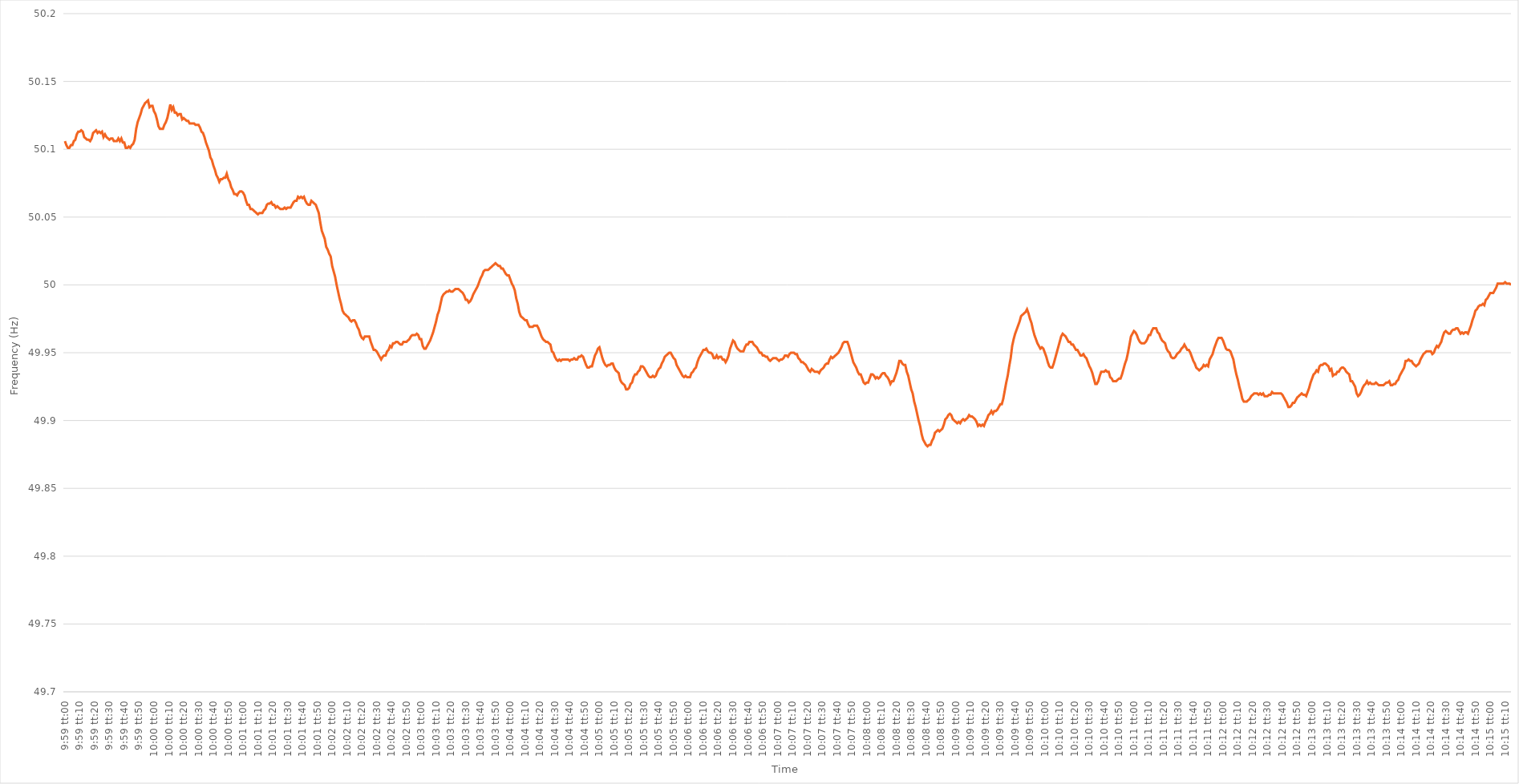
| Category | Series 0 |
|---|---|
| 0.4159722222222222 | 50.106 |
| 0.4159837962962963 | 50.103 |
| 0.4159953703703703 | 50.101 |
| 0.41600694444444447 | 50.101 |
| 0.4160185185185185 | 50.103 |
| 0.4160300925925926 | 50.103 |
| 0.41604166666666664 | 50.106 |
| 0.41605324074074074 | 50.107 |
| 0.4160648148148148 | 50.111 |
| 0.4160763888888889 | 50.113 |
| 0.41608796296296297 | 50.113 |
| 0.41609953703703706 | 50.114 |
| 0.4161111111111111 | 50.113 |
| 0.4161226851851852 | 50.109 |
| 0.41613425925925923 | 50.108 |
| 0.4161458333333334 | 50.107 |
| 0.4161574074074074 | 50.107 |
| 0.4161689814814815 | 50.106 |
| 0.41618055555555555 | 50.108 |
| 0.41619212962962965 | 50.112 |
| 0.4162037037037037 | 50.113 |
| 0.4162152777777777 | 50.114 |
| 0.4162268518518519 | 50.112 |
| 0.4162384259259259 | 50.113 |
| 0.41625 | 50.112 |
| 0.41626157407407405 | 50.113 |
| 0.41627314814814814 | 50.109 |
| 0.4162847222222222 | 50.111 |
| 0.41629629629629633 | 50.109 |
| 0.41630787037037037 | 50.108 |
| 0.41631944444444446 | 50.107 |
| 0.4163310185185185 | 50.108 |
| 0.4163425925925926 | 50.108 |
| 0.41635416666666664 | 50.106 |
| 0.4163657407407408 | 50.106 |
| 0.4163773148148148 | 50.106 |
| 0.4163888888888889 | 50.108 |
| 0.41640046296296296 | 50.106 |
| 0.41641203703703705 | 50.108 |
| 0.4164236111111111 | 50.105 |
| 0.41643518518518513 | 50.105 |
| 0.4164467592592593 | 50.101 |
| 0.4164583333333333 | 50.101 |
| 0.4164699074074074 | 50.102 |
| 0.41648148148148145 | 50.101 |
| 0.41649305555555555 | 50.103 |
| 0.4165046296296296 | 50.104 |
| 0.41651620370370374 | 50.107 |
| 0.4165277777777778 | 50.115 |
| 0.41653935185185187 | 50.12 |
| 0.4165509259259259 | 50.123 |
| 0.4165625 | 50.126 |
| 0.41657407407407404 | 50.13 |
| 0.4165856481481482 | 50.132 |
| 0.41659722222222223 | 50.134 |
| 0.4166087962962963 | 50.135 |
| 0.41662037037037036 | 50.136 |
| 0.41663194444444446 | 50.131 |
| 0.4166435185185185 | 50.132 |
| 0.41665509259259265 | 50.132 |
| 0.4166666666666667 | 50.128 |
| 0.4166782407407407 | 50.126 |
| 0.4166898148148148 | 50.122 |
| 0.41670138888888886 | 50.117 |
| 0.41671296296296295 | 50.115 |
| 0.416724537037037 | 50.115 |
| 0.41673611111111114 | 50.115 |
| 0.4167476851851852 | 50.118 |
| 0.4167592592592593 | 50.12 |
| 0.4167708333333333 | 50.123 |
| 0.4167824074074074 | 50.128 |
| 0.41679398148148145 | 50.133 |
| 0.4168055555555556 | 50.129 |
| 0.41681712962962963 | 50.131 |
| 0.41682870370370373 | 50.127 |
| 0.41684027777777777 | 50.127 |
| 0.41685185185185186 | 50.125 |
| 0.4168634259259259 | 50.126 |
| 0.41687500000000005 | 50.126 |
| 0.4168865740740741 | 50.122 |
| 0.4168981481481482 | 50.123 |
| 0.4169097222222222 | 50.122 |
| 0.41692129629629626 | 50.121 |
| 0.41693287037037036 | 50.121 |
| 0.4169444444444444 | 50.119 |
| 0.41695601851851855 | 50.119 |
| 0.4169675925925926 | 50.119 |
| 0.4169791666666667 | 50.119 |
| 0.4169907407407407 | 50.118 |
| 0.4170023148148148 | 50.118 |
| 0.41701388888888885 | 50.118 |
| 0.417025462962963 | 50.116 |
| 0.41703703703703704 | 50.113 |
| 0.41704861111111113 | 50.112 |
| 0.4170601851851852 | 50.109 |
| 0.41707175925925927 | 50.105 |
| 0.4170833333333333 | 50.102 |
| 0.41709490740740746 | 50.099 |
| 0.4171064814814815 | 50.094 |
| 0.4171180555555556 | 50.092 |
| 0.41712962962962963 | 50.088 |
| 0.41714120370370367 | 50.085 |
| 0.41715277777777776 | 50.081 |
| 0.4171643518518518 | 50.079 |
| 0.41717592592592595 | 50.076 |
| 0.4171875 | 50.078 |
| 0.4171990740740741 | 50.078 |
| 0.4172106481481481 | 50.079 |
| 0.4172222222222222 | 50.079 |
| 0.41723379629629626 | 50.082 |
| 0.4172453703703704 | 50.078 |
| 0.41725694444444444 | 50.076 |
| 0.41726851851851854 | 50.072 |
| 0.4172800925925926 | 50.07 |
| 0.41729166666666667 | 50.067 |
| 0.4173032407407407 | 50.067 |
| 0.41731481481481486 | 50.066 |
| 0.4173263888888889 | 50.068 |
| 0.417337962962963 | 50.069 |
| 0.41734953703703703 | 50.069 |
| 0.4173611111111111 | 50.068 |
| 0.41737268518518517 | 50.066 |
| 0.4173842592592592 | 50.062 |
| 0.41739583333333335 | 50.059 |
| 0.4174074074074074 | 50.059 |
| 0.4174189814814815 | 50.056 |
| 0.4174305555555555 | 50.056 |
| 0.4174421296296296 | 50.055 |
| 0.41745370370370366 | 50.054 |
| 0.4174652777777778 | 50.053 |
| 0.41747685185185185 | 50.052 |
| 0.41748842592592594 | 50.053 |
| 0.4175 | 50.053 |
| 0.4175115740740741 | 50.053 |
| 0.4175231481481481 | 50.055 |
| 0.41753472222222227 | 50.056 |
| 0.4175462962962963 | 50.059 |
| 0.4175578703703704 | 50.06 |
| 0.41756944444444444 | 50.06 |
| 0.41758101851851853 | 50.061 |
| 0.41759259259259257 | 50.059 |
| 0.4176041666666667 | 50.059 |
| 0.41761574074074076 | 50.057 |
| 0.4176273148148148 | 50.058 |
| 0.4176388888888889 | 50.057 |
| 0.41765046296296293 | 50.056 |
| 0.417662037037037 | 50.056 |
| 0.41767361111111106 | 50.056 |
| 0.4176851851851852 | 50.057 |
| 0.41769675925925925 | 50.056 |
| 0.41770833333333335 | 50.057 |
| 0.4177199074074074 | 50.057 |
| 0.4177314814814815 | 50.057 |
| 0.4177430555555555 | 50.059 |
| 0.41775462962962967 | 50.061 |
| 0.4177662037037037 | 50.062 |
| 0.4177777777777778 | 50.062 |
| 0.41778935185185184 | 50.065 |
| 0.41780092592592594 | 50.064 |
| 0.4178125 | 50.065 |
| 0.4178240740740741 | 50.064 |
| 0.41783564814814816 | 50.065 |
| 0.41784722222222226 | 50.062 |
| 0.4178587962962963 | 50.06 |
| 0.41787037037037034 | 50.059 |
| 0.41788194444444443 | 50.059 |
| 0.41789351851851847 | 50.062 |
| 0.4179050925925926 | 50.061 |
| 0.41791666666666666 | 50.06 |
| 0.41792824074074075 | 50.059 |
| 0.4179398148148148 | 50.056 |
| 0.4179513888888889 | 50.053 |
| 0.4179629629629629 | 50.046 |
| 0.4179745370370371 | 50.04 |
| 0.4179861111111111 | 50.037 |
| 0.4179976851851852 | 50.034 |
| 0.41800925925925925 | 50.028 |
| 0.41802083333333334 | 50.026 |
| 0.4180324074074074 | 50.023 |
| 0.41804398148148153 | 50.021 |
| 0.41805555555555557 | 50.014 |
| 0.41806712962962966 | 50.01 |
| 0.4180787037037037 | 50.006 |
| 0.41809027777777774 | 50 |
| 0.41810185185185184 | 49.995 |
| 0.4181134259259259 | 49.99 |
| 0.418125 | 49.986 |
| 0.41813657407407406 | 49.981 |
| 0.41814814814814816 | 49.979 |
| 0.4181597222222222 | 49.978 |
| 0.4181712962962963 | 49.977 |
| 0.41818287037037033 | 49.976 |
| 0.4181944444444445 | 49.974 |
| 0.4182060185185185 | 49.973 |
| 0.4182175925925926 | 49.974 |
| 0.41822916666666665 | 49.974 |
| 0.41824074074074075 | 49.972 |
| 0.4182523148148148 | 49.969 |
| 0.41826388888888894 | 49.967 |
| 0.418275462962963 | 49.963 |
| 0.41828703703703707 | 49.961 |
| 0.4182986111111111 | 49.96 |
| 0.4183101851851852 | 49.962 |
| 0.41832175925925924 | 49.962 |
| 0.4183333333333333 | 49.962 |
| 0.41834490740740743 | 49.962 |
| 0.41835648148148147 | 49.958 |
| 0.41836805555555556 | 49.955 |
| 0.4183796296296296 | 49.952 |
| 0.4183912037037037 | 49.952 |
| 0.41840277777777773 | 49.951 |
| 0.4184143518518519 | 49.949 |
| 0.4184259259259259 | 49.947 |
| 0.4184375 | 49.945 |
| 0.41844907407407406 | 49.947 |
| 0.41846064814814815 | 49.948 |
| 0.4184722222222222 | 49.948 |
| 0.41848379629629634 | 49.951 |
| 0.4184953703703704 | 49.952 |
| 0.4185069444444445 | 49.955 |
| 0.4185185185185185 | 49.954 |
| 0.4185300925925926 | 49.957 |
| 0.41854166666666665 | 49.957 |
| 0.4185532407407408 | 49.958 |
| 0.41856481481481483 | 49.958 |
| 0.4185763888888889 | 49.957 |
| 0.41858796296296297 | 49.956 |
| 0.418599537037037 | 49.956 |
| 0.4186111111111111 | 49.958 |
| 0.41862268518518514 | 49.958 |
| 0.4186342592592593 | 49.958 |
| 0.41864583333333333 | 49.959 |
| 0.4186574074074074 | 49.96 |
| 0.41866898148148146 | 49.962 |
| 0.41868055555555556 | 49.963 |
| 0.4186921296296296 | 49.963 |
| 0.41870370370370374 | 49.963 |
| 0.4187152777777778 | 49.964 |
| 0.4187268518518519 | 49.963 |
| 0.4187384259259259 | 49.96 |
| 0.41875 | 49.96 |
| 0.41876157407407405 | 49.955 |
| 0.4187731481481482 | 49.953 |
| 0.41878472222222224 | 49.953 |
| 0.41879629629629633 | 49.955 |
| 0.41880787037037037 | 49.957 |
| 0.4188194444444444 | 49.959 |
| 0.4188310185185185 | 49.962 |
| 0.41884259259259254 | 49.965 |
| 0.4188541666666667 | 49.969 |
| 0.41886574074074073 | 49.973 |
| 0.4188773148148148 | 49.978 |
| 0.41888888888888887 | 49.981 |
| 0.41890046296296296 | 49.986 |
| 0.418912037037037 | 49.991 |
| 0.41892361111111115 | 49.993 |
| 0.4189351851851852 | 49.994 |
| 0.4189467592592593 | 49.995 |
| 0.4189583333333333 | 49.995 |
| 0.4189699074074074 | 49.996 |
| 0.41898148148148145 | 49.995 |
| 0.4189930555555556 | 49.995 |
| 0.41900462962962964 | 49.996 |
| 0.41901620370370374 | 49.997 |
| 0.4190277777777778 | 49.997 |
| 0.4190393518518518 | 49.997 |
| 0.4190509259259259 | 49.996 |
| 0.41906249999999995 | 49.995 |
| 0.4190740740740741 | 49.994 |
| 0.41908564814814814 | 49.992 |
| 0.41909722222222223 | 49.989 |
| 0.41910879629629627 | 49.989 |
| 0.41912037037037037 | 49.987 |
| 0.4191319444444444 | 49.988 |
| 0.41914351851851855 | 49.99 |
| 0.4191550925925926 | 49.993 |
| 0.4191666666666667 | 49.995 |
| 0.4191782407407407 | 49.997 |
| 0.4191898148148148 | 49.999 |
| 0.41920138888888886 | 50.002 |
| 0.419212962962963 | 50.005 |
| 0.41922453703703705 | 50.007 |
| 0.41923611111111114 | 50.01 |
| 0.4192476851851852 | 50.011 |
| 0.4192592592592593 | 50.011 |
| 0.4192708333333333 | 50.011 |
| 0.41928240740740735 | 50.012 |
| 0.4192939814814815 | 50.013 |
| 0.41930555555555554 | 50.014 |
| 0.41931712962962964 | 50.015 |
| 0.4193287037037037 | 50.016 |
| 0.41934027777777777 | 50.015 |
| 0.4193518518518518 | 50.014 |
| 0.41936342592592596 | 50.014 |
| 0.419375 | 50.012 |
| 0.4193865740740741 | 50.012 |
| 0.41939814814814813 | 50.01 |
| 0.4194097222222222 | 50.008 |
| 0.41942129629629626 | 50.007 |
| 0.4194328703703704 | 50.007 |
| 0.41944444444444445 | 50.004 |
| 0.41945601851851855 | 50.001 |
| 0.4194675925925926 | 49.999 |
| 0.4194791666666667 | 49.996 |
| 0.4194907407407407 | 49.99 |
| 0.41950231481481487 | 49.986 |
| 0.4195138888888889 | 49.98 |
| 0.41952546296296295 | 49.977 |
| 0.41953703703703704 | 49.976 |
| 0.4195486111111111 | 49.975 |
| 0.4195601851851852 | 49.974 |
| 0.4195717592592592 | 49.974 |
| 0.41958333333333336 | 49.971 |
| 0.4195949074074074 | 49.969 |
| 0.4196064814814815 | 49.969 |
| 0.41961805555555554 | 49.969 |
| 0.41962962962962963 | 49.97 |
| 0.41964120370370367 | 49.97 |
| 0.4196527777777778 | 49.97 |
| 0.41966435185185186 | 49.968 |
| 0.41967592592592595 | 49.965 |
| 0.4196875 | 49.962 |
| 0.4196990740740741 | 49.96 |
| 0.4197106481481481 | 49.959 |
| 0.4197222222222223 | 49.958 |
| 0.4197337962962963 | 49.958 |
| 0.41974537037037035 | 49.957 |
| 0.41975694444444445 | 49.956 |
| 0.4197685185185185 | 49.951 |
| 0.4197800925925926 | 49.95 |
| 0.4197916666666666 | 49.947 |
| 0.41980324074074077 | 49.945 |
| 0.4198148148148148 | 49.944 |
| 0.4198263888888889 | 49.945 |
| 0.41983796296296294 | 49.944 |
| 0.41984953703703703 | 49.945 |
| 0.4198611111111111 | 49.945 |
| 0.4198726851851852 | 49.945 |
| 0.41988425925925926 | 49.945 |
| 0.41989583333333336 | 49.945 |
| 0.4199074074074074 | 49.944 |
| 0.4199189814814815 | 49.945 |
| 0.41993055555555553 | 49.945 |
| 0.4199421296296297 | 49.946 |
| 0.4199537037037037 | 49.945 |
| 0.4199652777777778 | 49.945 |
| 0.41997685185185185 | 49.947 |
| 0.4199884259259259 | 49.947 |
| 0.42 | 49.948 |
| 0.420011574074074 | 49.947 |
| 0.4200231481481482 | 49.944 |
| 0.4200347222222222 | 49.941 |
| 0.4200462962962963 | 49.939 |
| 0.42005787037037035 | 49.939 |
| 0.42006944444444444 | 49.94 |
| 0.4200810185185185 | 49.94 |
| 0.42009259259259263 | 49.944 |
| 0.42010416666666667 | 49.948 |
| 0.42011574074074076 | 49.95 |
| 0.4201273148148148 | 49.953 |
| 0.4201388888888889 | 49.954 |
| 0.42015046296296293 | 49.95 |
| 0.4201620370370371 | 49.946 |
| 0.4201736111111111 | 49.943 |
| 0.4201851851851852 | 49.941 |
| 0.42019675925925926 | 49.94 |
| 0.42020833333333335 | 49.941 |
| 0.4202199074074074 | 49.941 |
| 0.42023148148148143 | 49.942 |
| 0.4202430555555556 | 49.942 |
| 0.4202546296296296 | 49.939 |
| 0.4202662037037037 | 49.937 |
| 0.42027777777777775 | 49.936 |
| 0.42028935185185184 | 49.935 |
| 0.4203009259259259 | 49.93 |
| 0.42031250000000003 | 49.928 |
| 0.42032407407407407 | 49.927 |
| 0.42033564814814817 | 49.926 |
| 0.4203472222222222 | 49.923 |
| 0.4203587962962963 | 49.923 |
| 0.42037037037037034 | 49.924 |
| 0.4203819444444445 | 49.927 |
| 0.4203935185185185 | 49.928 |
| 0.4204050925925926 | 49.932 |
| 0.42041666666666666 | 49.934 |
| 0.42042824074074076 | 49.934 |
| 0.4204398148148148 | 49.936 |
| 0.42045138888888894 | 49.937 |
| 0.420462962962963 | 49.94 |
| 0.420474537037037 | 49.94 |
| 0.4204861111111111 | 49.939 |
| 0.42049768518518515 | 49.937 |
| 0.42050925925925925 | 49.935 |
| 0.4205208333333333 | 49.933 |
| 0.42053240740740744 | 49.932 |
| 0.4205439814814815 | 49.932 |
| 0.42055555555555557 | 49.933 |
| 0.4205671296296296 | 49.932 |
| 0.4205787037037037 | 49.933 |
| 0.42059027777777774 | 49.936 |
| 0.4206018518518519 | 49.938 |
| 0.42061342592592593 | 49.939 |
| 0.420625 | 49.942 |
| 0.42063657407407407 | 49.944 |
| 0.42064814814814816 | 49.947 |
| 0.4206597222222222 | 49.948 |
| 0.42067129629629635 | 49.949 |
| 0.4206828703703704 | 49.95 |
| 0.4206944444444444 | 49.95 |
| 0.4207060185185185 | 49.948 |
| 0.42071759259259256 | 49.946 |
| 0.42072916666666665 | 49.945 |
| 0.4207407407407407 | 49.941 |
| 0.42075231481481484 | 49.939 |
| 0.4207638888888889 | 49.937 |
| 0.420775462962963 | 49.935 |
| 0.420787037037037 | 49.933 |
| 0.4207986111111111 | 49.932 |
| 0.42081018518518515 | 49.933 |
| 0.4208217592592593 | 49.932 |
| 0.42083333333333334 | 49.932 |
| 0.42084490740740743 | 49.932 |
| 0.42085648148148147 | 49.935 |
| 0.42086805555555556 | 49.936 |
| 0.4208796296296296 | 49.938 |
| 0.42089120370370375 | 49.939 |
| 0.4209027777777778 | 49.943 |
| 0.4209143518518519 | 49.946 |
| 0.4209259259259259 | 49.948 |
| 0.42093749999999996 | 49.95 |
| 0.42094907407407406 | 49.952 |
| 0.4209606481481481 | 49.952 |
| 0.42097222222222225 | 49.953 |
| 0.4209837962962963 | 49.951 |
| 0.4209953703703704 | 49.95 |
| 0.4210069444444444 | 49.95 |
| 0.4210185185185185 | 49.949 |
| 0.42103009259259255 | 49.946 |
| 0.4210416666666667 | 49.946 |
| 0.42105324074074074 | 49.948 |
| 0.42106481481481484 | 49.946 |
| 0.4210763888888889 | 49.947 |
| 0.42108796296296297 | 49.947 |
| 0.421099537037037 | 49.945 |
| 0.42111111111111116 | 49.945 |
| 0.4211226851851852 | 49.943 |
| 0.4211342592592593 | 49.945 |
| 0.42114583333333333 | 49.948 |
| 0.4211574074074074 | 49.953 |
| 0.42116898148148146 | 49.956 |
| 0.4211805555555555 | 49.959 |
| 0.42119212962962965 | 49.958 |
| 0.4212037037037037 | 49.955 |
| 0.4212152777777778 | 49.953 |
| 0.4212268518518518 | 49.952 |
| 0.4212384259259259 | 49.951 |
| 0.42124999999999996 | 49.951 |
| 0.4212615740740741 | 49.951 |
| 0.42127314814814815 | 49.954 |
| 0.42128472222222224 | 49.956 |
| 0.4212962962962963 | 49.956 |
| 0.4213078703703704 | 49.958 |
| 0.4213194444444444 | 49.958 |
| 0.42133101851851856 | 49.958 |
| 0.4213425925925926 | 49.956 |
| 0.4213541666666667 | 49.955 |
| 0.42136574074074074 | 49.954 |
| 0.42137731481481483 | 49.952 |
| 0.42138888888888887 | 49.95 |
| 0.421400462962963 | 49.95 |
| 0.42141203703703706 | 49.948 |
| 0.4214236111111111 | 49.948 |
| 0.4214351851851852 | 49.947 |
| 0.42144675925925923 | 49.947 |
| 0.4214583333333333 | 49.945 |
| 0.42146990740740736 | 49.944 |
| 0.4214814814814815 | 49.945 |
| 0.42149305555555555 | 49.946 |
| 0.42150462962962965 | 49.946 |
| 0.4215162037037037 | 49.946 |
| 0.4215277777777778 | 49.945 |
| 0.4215393518518518 | 49.944 |
| 0.42155092592592597 | 49.945 |
| 0.4215625 | 49.945 |
| 0.4215740740740741 | 49.946 |
| 0.42158564814814814 | 49.948 |
| 0.42159722222222223 | 49.948 |
| 0.4216087962962963 | 49.947 |
| 0.4216203703703704 | 49.949 |
| 0.42163194444444446 | 49.95 |
| 0.4216435185185185 | 49.95 |
| 0.4216550925925926 | 49.95 |
| 0.42166666666666663 | 49.949 |
| 0.42167824074074073 | 49.949 |
| 0.42168981481481477 | 49.946 |
| 0.4217013888888889 | 49.945 |
| 0.42171296296296296 | 49.943 |
| 0.42172453703703705 | 49.943 |
| 0.4217361111111111 | 49.942 |
| 0.4217476851851852 | 49.941 |
| 0.4217592592592592 | 49.939 |
| 0.4217708333333334 | 49.937 |
| 0.4217824074074074 | 49.936 |
| 0.4217939814814815 | 49.938 |
| 0.42180555555555554 | 49.937 |
| 0.42181712962962964 | 49.936 |
| 0.4218287037037037 | 49.936 |
| 0.42184027777777783 | 49.936 |
| 0.42185185185185187 | 49.935 |
| 0.42186342592592596 | 49.937 |
| 0.421875 | 49.938 |
| 0.42188657407407404 | 49.939 |
| 0.42189814814814813 | 49.941 |
| 0.42190972222222217 | 49.942 |
| 0.4219212962962963 | 49.942 |
| 0.42193287037037036 | 49.945 |
| 0.42194444444444446 | 49.947 |
| 0.4219560185185185 | 49.946 |
| 0.4219675925925926 | 49.947 |
| 0.4219791666666666 | 49.948 |
| 0.4219907407407408 | 49.949 |
| 0.4220023148148148 | 49.95 |
| 0.4220138888888889 | 49.952 |
| 0.42202546296296295 | 49.954 |
| 0.42203703703703704 | 49.957 |
| 0.4220486111111111 | 49.958 |
| 0.42206018518518523 | 49.958 |
| 0.42207175925925927 | 49.958 |
| 0.42208333333333337 | 49.955 |
| 0.4220949074074074 | 49.951 |
| 0.4221064814814815 | 49.947 |
| 0.42211805555555554 | 49.943 |
| 0.4221296296296296 | 49.941 |
| 0.4221412037037037 | 49.939 |
| 0.42215277777777777 | 49.936 |
| 0.42216435185185186 | 49.934 |
| 0.4221759259259259 | 49.934 |
| 0.4221875 | 49.931 |
| 0.42219907407407403 | 49.928 |
| 0.4222106481481482 | 49.927 |
| 0.4222222222222222 | 49.928 |
| 0.4222337962962963 | 49.928 |
| 0.42224537037037035 | 49.931 |
| 0.42225694444444445 | 49.934 |
| 0.4222685185185185 | 49.934 |
| 0.42228009259259264 | 49.933 |
| 0.4222916666666667 | 49.931 |
| 0.42230324074074077 | 49.932 |
| 0.4223148148148148 | 49.931 |
| 0.4223263888888889 | 49.932 |
| 0.42233796296296294 | 49.934 |
| 0.422349537037037 | 49.935 |
| 0.42236111111111113 | 49.935 |
| 0.42237268518518517 | 49.933 |
| 0.42238425925925926 | 49.932 |
| 0.4223958333333333 | 49.93 |
| 0.4224074074074074 | 49.927 |
| 0.42241898148148144 | 49.929 |
| 0.4224305555555556 | 49.929 |
| 0.4224421296296296 | 49.932 |
| 0.4224537037037037 | 49.935 |
| 0.42246527777777776 | 49.939 |
| 0.42247685185185185 | 49.944 |
| 0.4224884259259259 | 49.944 |
| 0.42250000000000004 | 49.942 |
| 0.4225115740740741 | 49.941 |
| 0.4225231481481482 | 49.941 |
| 0.4225347222222222 | 49.936 |
| 0.4225462962962963 | 49.933 |
| 0.42255787037037035 | 49.928 |
| 0.4225694444444445 | 49.923 |
| 0.42258101851851854 | 49.92 |
| 0.4225925925925926 | 49.914 |
| 0.42260416666666667 | 49.91 |
| 0.4226157407407407 | 49.905 |
| 0.4226273148148148 | 49.9 |
| 0.42263888888888884 | 49.896 |
| 0.422650462962963 | 49.89 |
| 0.42266203703703703 | 49.886 |
| 0.4226736111111111 | 49.884 |
| 0.42268518518518516 | 49.882 |
| 0.42269675925925926 | 49.881 |
| 0.4227083333333333 | 49.882 |
| 0.42271990740740745 | 49.882 |
| 0.4227314814814815 | 49.885 |
| 0.4227430555555556 | 49.887 |
| 0.4227546296296296 | 49.891 |
| 0.4227662037037037 | 49.892 |
| 0.42277777777777775 | 49.893 |
| 0.4227893518518519 | 49.892 |
| 0.42280092592592594 | 49.893 |
| 0.42281250000000004 | 49.894 |
| 0.4228240740740741 | 49.897 |
| 0.4228356481481481 | 49.901 |
| 0.4228472222222222 | 49.902 |
| 0.42285879629629625 | 49.904 |
| 0.4228703703703704 | 49.905 |
| 0.42288194444444444 | 49.904 |
| 0.42289351851851853 | 49.901 |
| 0.42290509259259257 | 49.9 |
| 0.42291666666666666 | 49.899 |
| 0.4229282407407407 | 49.898 |
| 0.42293981481481485 | 49.899 |
| 0.4229513888888889 | 49.898 |
| 0.422962962962963 | 49.9 |
| 0.422974537037037 | 49.901 |
| 0.4229861111111111 | 49.9 |
| 0.42299768518518516 | 49.901 |
| 0.4230092592592593 | 49.902 |
| 0.42302083333333335 | 49.904 |
| 0.42303240740740744 | 49.903 |
| 0.4230439814814815 | 49.903 |
| 0.4230555555555555 | 49.902 |
| 0.4230671296296296 | 49.901 |
| 0.42307870370370365 | 49.899 |
| 0.4230902777777778 | 49.896 |
| 0.42310185185185184 | 49.897 |
| 0.42311342592592593 | 49.896 |
| 0.423125 | 49.897 |
| 0.42313657407407407 | 49.896 |
| 0.4231481481481481 | 49.899 |
| 0.42315972222222226 | 49.901 |
| 0.4231712962962963 | 49.904 |
| 0.4231828703703704 | 49.905 |
| 0.42319444444444443 | 49.907 |
| 0.4232060185185185 | 49.905 |
| 0.42321759259259256 | 49.907 |
| 0.4232291666666667 | 49.907 |
| 0.42324074074074075 | 49.908 |
| 0.42325231481481485 | 49.91 |
| 0.4232638888888889 | 49.912 |
| 0.423275462962963 | 49.912 |
| 0.423287037037037 | 49.916 |
| 0.42329861111111117 | 49.922 |
| 0.4233101851851852 | 49.928 |
| 0.42332175925925924 | 49.933 |
| 0.42333333333333334 | 49.94 |
| 0.4233449074074074 | 49.946 |
| 0.4233564814814815 | 49.955 |
| 0.4233680555555555 | 49.96 |
| 0.42337962962962966 | 49.964 |
| 0.4233912037037037 | 49.967 |
| 0.4234027777777778 | 49.97 |
| 0.42341435185185183 | 49.973 |
| 0.42342592592592593 | 49.977 |
| 0.42343749999999997 | 49.978 |
| 0.4234490740740741 | 49.979 |
| 0.42346064814814816 | 49.98 |
| 0.42347222222222225 | 49.982 |
| 0.4234837962962963 | 49.979 |
| 0.4234953703703704 | 49.975 |
| 0.4235069444444444 | 49.972 |
| 0.42351851851851857 | 49.967 |
| 0.4235300925925926 | 49.963 |
| 0.42354166666666665 | 49.96 |
| 0.42355324074074074 | 49.957 |
| 0.4235648148148148 | 49.955 |
| 0.4235763888888889 | 49.953 |
| 0.4235879629629629 | 49.954 |
| 0.42359953703703707 | 49.953 |
| 0.4236111111111111 | 49.95 |
| 0.4236226851851852 | 49.947 |
| 0.42363425925925924 | 49.943 |
| 0.42364583333333333 | 49.94 |
| 0.42365740740740737 | 49.939 |
| 0.4236689814814815 | 49.939 |
| 0.42368055555555556 | 49.942 |
| 0.42369212962962965 | 49.946 |
| 0.4237037037037037 | 49.95 |
| 0.4237152777777778 | 49.954 |
| 0.4237268518518518 | 49.958 |
| 0.423738425925926 | 49.962 |
| 0.42375 | 49.964 |
| 0.4237615740740741 | 49.963 |
| 0.42377314814814815 | 49.962 |
| 0.4237847222222222 | 49.96 |
| 0.4237962962962963 | 49.958 |
| 0.4238078703703703 | 49.958 |
| 0.42381944444444447 | 49.956 |
| 0.4238310185185185 | 49.956 |
| 0.4238425925925926 | 49.954 |
| 0.42385416666666664 | 49.952 |
| 0.42386574074074074 | 49.952 |
| 0.4238773148148148 | 49.95 |
| 0.4238888888888889 | 49.948 |
| 0.42390046296296297 | 49.948 |
| 0.42391203703703706 | 49.949 |
| 0.4239236111111111 | 49.947 |
| 0.4239351851851852 | 49.946 |
| 0.42394675925925923 | 49.943 |
| 0.4239583333333334 | 49.94 |
| 0.4239699074074074 | 49.938 |
| 0.4239814814814815 | 49.935 |
| 0.42399305555555555 | 49.931 |
| 0.42400462962962965 | 49.927 |
| 0.4240162037037037 | 49.927 |
| 0.4240277777777777 | 49.929 |
| 0.4240393518518519 | 49.933 |
| 0.4240509259259259 | 49.936 |
| 0.4240625 | 49.936 |
| 0.42407407407407405 | 49.936 |
| 0.42408564814814814 | 49.937 |
| 0.4240972222222222 | 49.936 |
| 0.42410879629629633 | 49.936 |
| 0.42412037037037037 | 49.932 |
| 0.42413194444444446 | 49.931 |
| 0.4241435185185185 | 49.929 |
| 0.4241550925925926 | 49.929 |
| 0.42416666666666664 | 49.929 |
| 0.4241782407407408 | 49.93 |
| 0.4241898148148148 | 49.931 |
| 0.4242013888888889 | 49.931 |
| 0.42421296296296296 | 49.934 |
| 0.42422453703703705 | 49.938 |
| 0.4242361111111111 | 49.942 |
| 0.42424768518518513 | 49.945 |
| 0.4242592592592593 | 49.95 |
| 0.4242708333333333 | 49.956 |
| 0.4242824074074074 | 49.962 |
| 0.42429398148148145 | 49.964 |
| 0.42430555555555555 | 49.966 |
| 0.4243171296296296 | 49.965 |
| 0.42432870370370374 | 49.963 |
| 0.4243402777777778 | 49.96 |
| 0.42435185185185187 | 49.958 |
| 0.4243634259259259 | 49.957 |
| 0.424375 | 49.957 |
| 0.42438657407407404 | 49.957 |
| 0.4243981481481482 | 49.958 |
| 0.42440972222222223 | 49.96 |
| 0.4244212962962963 | 49.963 |
| 0.42443287037037036 | 49.963 |
| 0.42444444444444446 | 49.966 |
| 0.4244560185185185 | 49.968 |
| 0.42446759259259265 | 49.968 |
| 0.4244791666666667 | 49.968 |
| 0.4244907407407407 | 49.965 |
| 0.4245023148148148 | 49.964 |
| 0.42451388888888886 | 49.961 |
| 0.42452546296296295 | 49.959 |
| 0.424537037037037 | 49.958 |
| 0.42454861111111114 | 49.957 |
| 0.4245601851851852 | 49.953 |
| 0.4245717592592593 | 49.951 |
| 0.4245833333333333 | 49.95 |
| 0.4245949074074074 | 49.947 |
| 0.42460648148148145 | 49.946 |
| 0.4246180555555556 | 49.946 |
| 0.42462962962962963 | 49.947 |
| 0.42464120370370373 | 49.949 |
| 0.42465277777777777 | 49.95 |
| 0.42466435185185186 | 49.951 |
| 0.4246759259259259 | 49.953 |
| 0.42468750000000005 | 49.954 |
| 0.4246990740740741 | 49.956 |
| 0.4247106481481482 | 49.954 |
| 0.4247222222222222 | 49.952 |
| 0.42473379629629626 | 49.952 |
| 0.42474537037037036 | 49.95 |
| 0.4247569444444444 | 49.947 |
| 0.42476851851851855 | 49.944 |
| 0.4247800925925926 | 49.942 |
| 0.4247916666666667 | 49.939 |
| 0.4248032407407407 | 49.938 |
| 0.4248148148148148 | 49.937 |
| 0.42482638888888885 | 49.938 |
| 0.424837962962963 | 49.939 |
| 0.42484953703703704 | 49.941 |
| 0.42486111111111113 | 49.94 |
| 0.4248726851851852 | 49.941 |
| 0.42488425925925927 | 49.94 |
| 0.4248958333333333 | 49.945 |
| 0.42490740740740746 | 49.947 |
| 0.4249189814814815 | 49.949 |
| 0.4249305555555556 | 49.953 |
| 0.42494212962962963 | 49.956 |
| 0.42495370370370367 | 49.959 |
| 0.42496527777777776 | 49.961 |
| 0.4249768518518518 | 49.961 |
| 0.42498842592592595 | 49.961 |
| 0.425 | 49.959 |
| 0.4250115740740741 | 49.956 |
| 0.4250231481481481 | 49.953 |
| 0.4250347222222222 | 49.952 |
| 0.42504629629629626 | 49.952 |
| 0.4250578703703704 | 49.951 |
| 0.42506944444444444 | 49.948 |
| 0.42508101851851854 | 49.945 |
| 0.4250925925925926 | 49.939 |
| 0.42510416666666667 | 49.934 |
| 0.4251157407407407 | 49.93 |
| 0.42512731481481486 | 49.925 |
| 0.4251388888888889 | 49.921 |
| 0.425150462962963 | 49.916 |
| 0.42516203703703703 | 49.914 |
| 0.4251736111111111 | 49.914 |
| 0.42518518518518517 | 49.914 |
| 0.4251967592592592 | 49.915 |
| 0.42520833333333335 | 49.916 |
| 0.4252199074074074 | 49.918 |
| 0.4252314814814815 | 49.919 |
| 0.4252430555555555 | 49.92 |
| 0.4252546296296296 | 49.92 |
| 0.42526620370370366 | 49.92 |
| 0.4252777777777778 | 49.919 |
| 0.42528935185185185 | 49.92 |
| 0.42530092592592594 | 49.919 |
| 0.4253125 | 49.92 |
| 0.4253240740740741 | 49.918 |
| 0.4253356481481481 | 49.918 |
| 0.42534722222222227 | 49.918 |
| 0.4253587962962963 | 49.919 |
| 0.4253703703703704 | 49.919 |
| 0.42538194444444444 | 49.921 |
| 0.42539351851851853 | 49.92 |
| 0.42540509259259257 | 49.92 |
| 0.4254166666666667 | 49.92 |
| 0.42542824074074076 | 49.92 |
| 0.4254398148148148 | 49.92 |
| 0.4254513888888889 | 49.92 |
| 0.42546296296296293 | 49.919 |
| 0.425474537037037 | 49.917 |
| 0.42548611111111106 | 49.915 |
| 0.4254976851851852 | 49.913 |
| 0.42550925925925925 | 49.91 |
| 0.42552083333333335 | 49.91 |
| 0.4255324074074074 | 49.911 |
| 0.4255439814814815 | 49.913 |
| 0.4255555555555555 | 49.913 |
| 0.42556712962962967 | 49.915 |
| 0.4255787037037037 | 49.917 |
| 0.4255902777777778 | 49.918 |
| 0.42560185185185184 | 49.919 |
| 0.42561342592592594 | 49.92 |
| 0.425625 | 49.919 |
| 0.4256365740740741 | 49.919 |
| 0.42564814814814816 | 49.918 |
| 0.4256597222222222 | 49.921 |
| 0.4256712962962963 | 49.924 |
| 0.42568287037037034 | 49.928 |
| 0.42569444444444443 | 49.931 |
| 0.42570601851851847 | 49.934 |
| 0.4257175925925926 | 49.935 |
| 0.42572916666666666 | 49.937 |
| 0.42574074074074075 | 49.936 |
| 0.4257523148148148 | 49.94 |
| 0.4257638888888889 | 49.941 |
| 0.4257754629629629 | 49.941 |
| 0.4257870370370371 | 49.942 |
| 0.4257986111111111 | 49.942 |
| 0.4258101851851852 | 49.941 |
| 0.42582175925925925 | 49.94 |
| 0.42583333333333334 | 49.937 |
| 0.4258449074074074 | 49.938 |
| 0.42585648148148153 | 49.933 |
| 0.42586805555555557 | 49.934 |
| 0.42587962962962966 | 49.934 |
| 0.4258912037037037 | 49.936 |
| 0.4259027777777778 | 49.936 |
| 0.42591435185185184 | 49.938 |
| 0.4259259259259259 | 49.939 |
| 0.4259375 | 49.939 |
| 0.42594907407407406 | 49.938 |
| 0.42596064814814816 | 49.936 |
| 0.4259722222222222 | 49.935 |
| 0.4259837962962963 | 49.934 |
| 0.42599537037037033 | 49.929 |
| 0.4260069444444445 | 49.929 |
| 0.4260185185185185 | 49.927 |
| 0.4260300925925926 | 49.925 |
| 0.42604166666666665 | 49.92 |
| 0.42605324074074075 | 49.918 |
| 0.4260648148148148 | 49.919 |
| 0.42607638888888894 | 49.921 |
| 0.426087962962963 | 49.924 |
| 0.42609953703703707 | 49.926 |
| 0.4261111111111111 | 49.927 |
| 0.4261226851851852 | 49.929 |
| 0.42613425925925924 | 49.927 |
| 0.4261458333333333 | 49.928 |
| 0.42615740740740743 | 49.927 |
| 0.42616898148148147 | 49.927 |
| 0.42618055555555556 | 49.927 |
| 0.4261921296296296 | 49.928 |
| 0.4262037037037037 | 49.927 |
| 0.42621527777777773 | 49.926 |
| 0.4262268518518519 | 49.926 |
| 0.4262384259259259 | 49.926 |
| 0.42625 | 49.926 |
| 0.42626157407407406 | 49.927 |
| 0.42627314814814815 | 49.928 |
| 0.4262847222222222 | 49.928 |
| 0.42629629629629634 | 49.929 |
| 0.4263078703703704 | 49.926 |
| 0.4263194444444445 | 49.926 |
| 0.4263310185185185 | 49.927 |
| 0.4263425925925926 | 49.927 |
| 0.42635416666666665 | 49.929 |
| 0.4263657407407408 | 49.93 |
| 0.42637731481481483 | 49.933 |
| 0.4263888888888889 | 49.935 |
| 0.42640046296296297 | 49.937 |
| 0.426412037037037 | 49.939 |
| 0.4264236111111111 | 49.944 |
| 0.42643518518518514 | 49.944 |
| 0.4264467592592593 | 49.945 |
| 0.42645833333333333 | 49.944 |
| 0.4264699074074074 | 49.944 |
| 0.42648148148148146 | 49.942 |
| 0.42649305555555556 | 49.941 |
| 0.4265046296296296 | 49.94 |
| 0.42651620370370374 | 49.941 |
| 0.4265277777777778 | 49.942 |
| 0.4265393518518519 | 49.945 |
| 0.4265509259259259 | 49.947 |
| 0.4265625 | 49.949 |
| 0.42657407407407405 | 49.95 |
| 0.4265856481481482 | 49.951 |
| 0.42659722222222224 | 49.951 |
| 0.42660879629629633 | 49.951 |
| 0.42662037037037037 | 49.951 |
| 0.4266319444444444 | 49.949 |
| 0.4266435185185185 | 49.95 |
| 0.42665509259259254 | 49.953 |
| 0.4266666666666667 | 49.955 |
| 0.42667824074074073 | 49.954 |
| 0.4266898148148148 | 49.956 |
| 0.42670138888888887 | 49.958 |
| 0.42671296296296296 | 49.962 |
| 0.426724537037037 | 49.965 |
| 0.42673611111111115 | 49.966 |
| 0.4267476851851852 | 49.965 |
| 0.4267592592592593 | 49.964 |
| 0.4267708333333333 | 49.964 |
| 0.4267824074074074 | 49.966 |
| 0.42679398148148145 | 49.967 |
| 0.4268055555555556 | 49.967 |
| 0.42681712962962964 | 49.968 |
| 0.42682870370370374 | 49.968 |
| 0.4268402777777778 | 49.966 |
| 0.4268518518518518 | 49.964 |
| 0.4268634259259259 | 49.965 |
| 0.42687499999999995 | 49.964 |
| 0.4268865740740741 | 49.965 |
| 0.42689814814814814 | 49.965 |
| 0.42690972222222223 | 49.964 |
| 0.42692129629629627 | 49.967 |
| 0.42693287037037037 | 49.97 |
| 0.4269444444444444 | 49.974 |
| 0.42695601851851855 | 49.977 |
| 0.4269675925925926 | 49.981 |
| 0.4269791666666667 | 49.982 |
| 0.4269907407407407 | 49.984 |
| 0.4270023148148148 | 49.985 |
| 0.42701388888888886 | 49.985 |
| 0.427025462962963 | 49.986 |
| 0.42703703703703705 | 49.985 |
| 0.42704861111111114 | 49.989 |
| 0.4270601851851852 | 49.99 |
| 0.4270717592592593 | 49.992 |
| 0.4270833333333333 | 49.994 |
| 0.42709490740740735 | 49.994 |
| 0.4271064814814815 | 49.994 |
| 0.42711805555555554 | 49.996 |
| 0.42712962962962964 | 49.998 |
| 0.4271412037037037 | 50.001 |
| 0.42715277777777777 | 50.001 |
| 0.4271643518518518 | 50.001 |
| 0.42717592592592596 | 50.001 |
| 0.4271875 | 50.001 |
| 0.4271990740740741 | 50.002 |
| 0.42721064814814813 | 50.001 |
| 0.4272222222222222 | 50.001 |
| 0.42723379629629626 | 50.001 |
| 0.4272453703703704 | 50 |